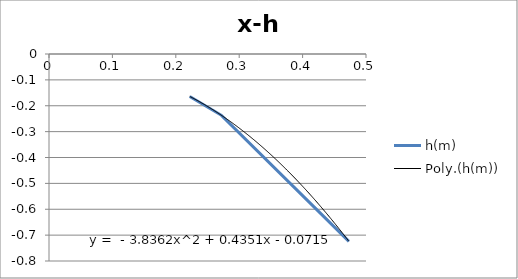
| Category | h(m) |
|---|---|
| 0.222 | -0.164 |
| 0.272 | -0.237 |
| 0.473 | -0.724 |